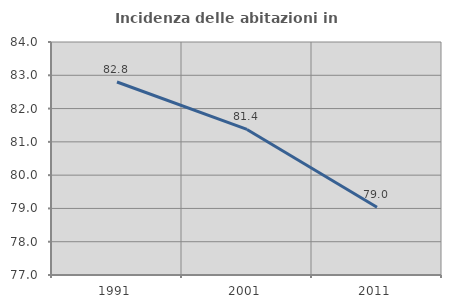
| Category | Incidenza delle abitazioni in proprietà  |
|---|---|
| 1991.0 | 82.798 |
| 2001.0 | 81.373 |
| 2011.0 | 79.037 |